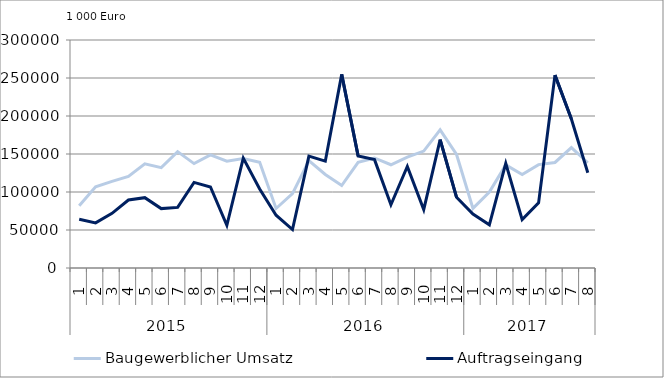
| Category | Baugewerblicher Umsatz | Auftragseingang |
|---|---|---|
| 0 | 81937.361 | 64244.383 |
| 1 | 106908.454 | 59377.677 |
| 2 | 113904.285 | 71953.971 |
| 3 | 120612.446 | 89496.024 |
| 4 | 137142.75 | 92563.213 |
| 5 | 132019.811 | 78131.737 |
| 6 | 153125.961 | 79765.729 |
| 7 | 137370.133 | 112637.987 |
| 8 | 148792.629 | 106572.56 |
| 9 | 140483.911 | 56073.767 |
| 10 | 144146.162 | 144643.688 |
| 11 | 139085.889 | 103931.175 |
| 12 | 78291.738 | 69470.357 |
| 13 | 97863.379 | 50640.033 |
| 14 | 141176.119 | 147206.65 |
| 15 | 123121.297 | 140579.009 |
| 16 | 108561.124 | 254739.334 |
| 17 | 139030.209 | 147481.644 |
| 18 | 144784.416 | 142609.658 |
| 19 | 135870.195 | 83192.156 |
| 20 | 145961.738 | 133594.351 |
| 21 | 153886.826 | 76793.838 |
| 22 | 181740.037 | 168867.568 |
| 23 | 149348.138 | 93011.853 |
| 24 | 78446.78 | 70908.903 |
| 25 | 99841.908 | 56868.408 |
| 26 | 135679.867 | 137790.423 |
| 27 | 123004.403 | 63637.761 |
| 28 | 136010.071 | 85644.63 |
| 29 | 138859.308 | 253791.552 |
| 30 | 158353.879 | 196034.198 |
| 31 | 138510.315 | 125319.873 |